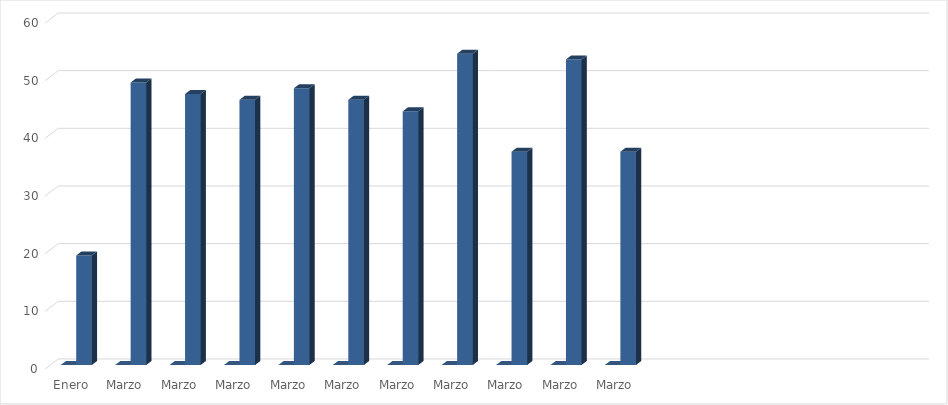
| Category | Series 0 | Series 1 |
|---|---|---|
| Enero | 0 | 19 |
| Marzo | 0 | 49 |
| Marzo | 0 | 47 |
| Marzo | 0 | 46 |
| Marzo | 0 | 48 |
| Marzo | 0 | 46 |
| Marzo | 0 | 44 |
| Marzo | 0 | 54 |
| Marzo | 0 | 37 |
| Marzo | 0 | 53 |
| Marzo | 0 | 37 |